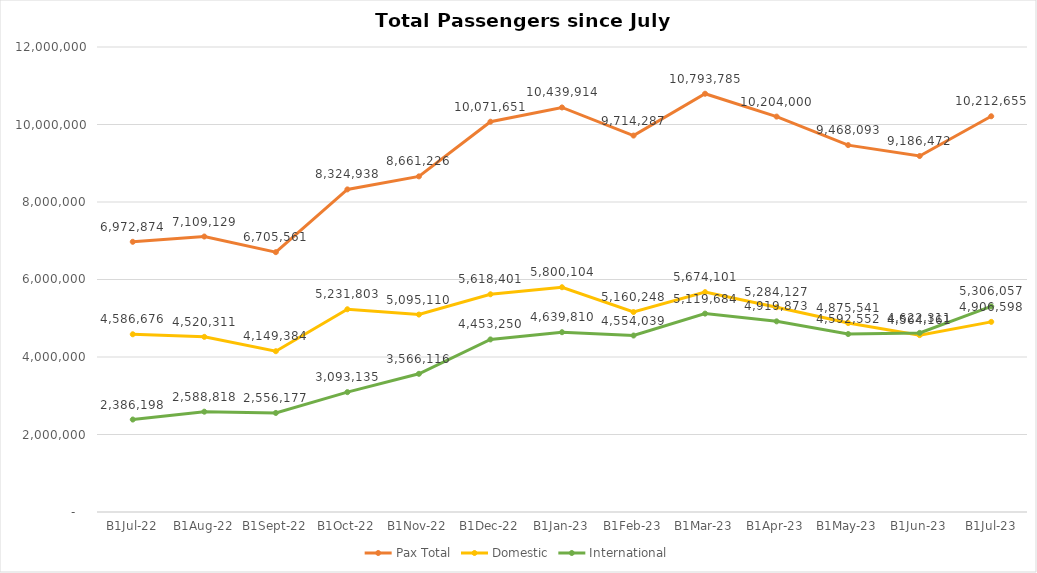
| Category | Pax Total | Domestic | International |
|---|---|---|---|
| 2022-07-01 | 6972874 | 4586676 | 2386198 |
| 2022-08-01 | 7109129 | 4520311 | 2588818 |
| 2022-09-01 | 6705561 | 4149384 | 2556177 |
| 2022-10-01 | 8324938 | 5231803 | 3093135 |
| 2022-11-01 | 8661226 | 5095110 | 3566116 |
| 2022-12-01 | 10071651 | 5618401 | 4453250 |
| 2023-01-01 | 10439914 | 5800104 | 4639810 |
| 2023-02-01 | 9714287 | 5160248 | 4554039 |
| 2023-03-01 | 10793785 | 5674101 | 5119684 |
| 2023-04-01 | 10204000 | 5284127 | 4919873 |
| 2023-05-01 | 9468093 | 4875541 | 4592552 |
| 2023-06-01 | 9186472 | 4564161 | 4622311 |
| 2023-07-01 | 10212655 | 4906598 | 5306057 |